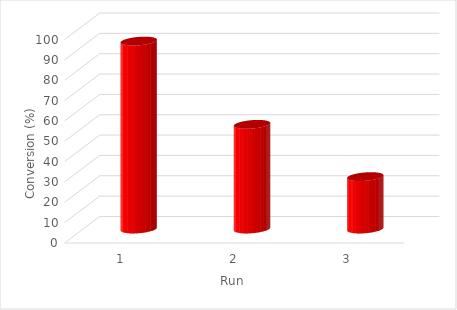
| Category | conversion |
|---|---|
| 0 | 92.353 |
| 1 | 51.43 |
| 2 | 25.739 |